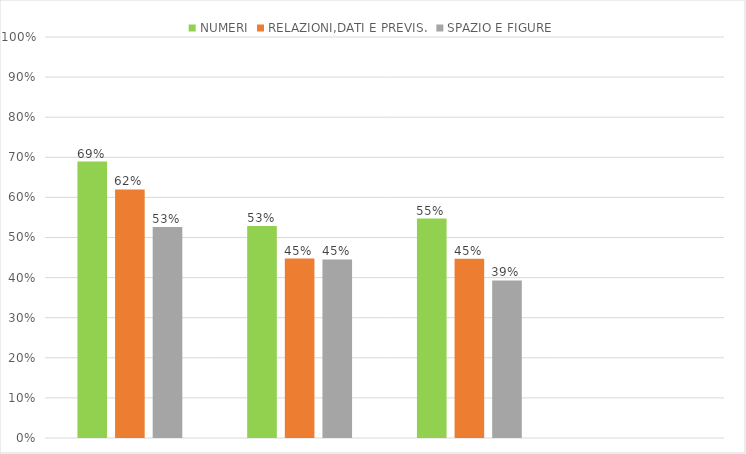
| Category | NUMERI | RELAZIONI,DATI E PREVIS. | SPAZIO E FIGURE |
|---|---|---|---|
| 2A Vivaldi | 0.689 | 0.62 | 0.526 |
| 2B Vivaldi | 0.528 | 0.447 | 0.445 |
| 2C Vivaldi | 0.547 | 0.447 | 0.393 |